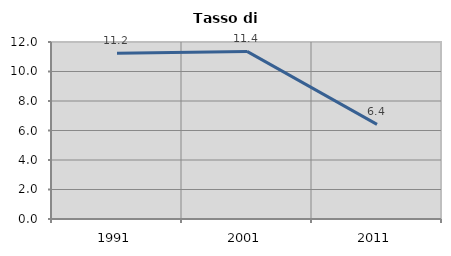
| Category | Tasso di disoccupazione   |
|---|---|
| 1991.0 | 11.243 |
| 2001.0 | 11.364 |
| 2011.0 | 6.417 |